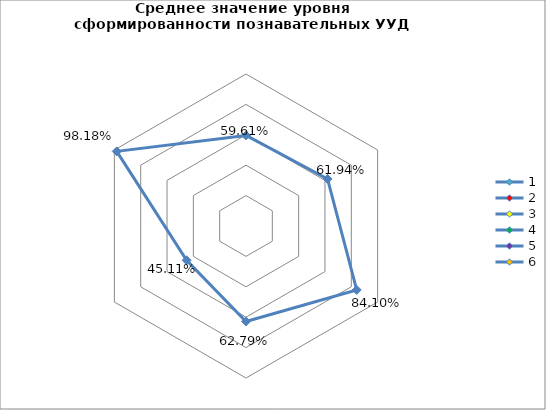
| Category | Series 0 |
|---|---|
| 0 | 0.596 |
| 1 | 0.619 |
| 2 | 0.841 |
| 3 | 0.628 |
| 4 | 0.451 |
| 5 | 0.982 |